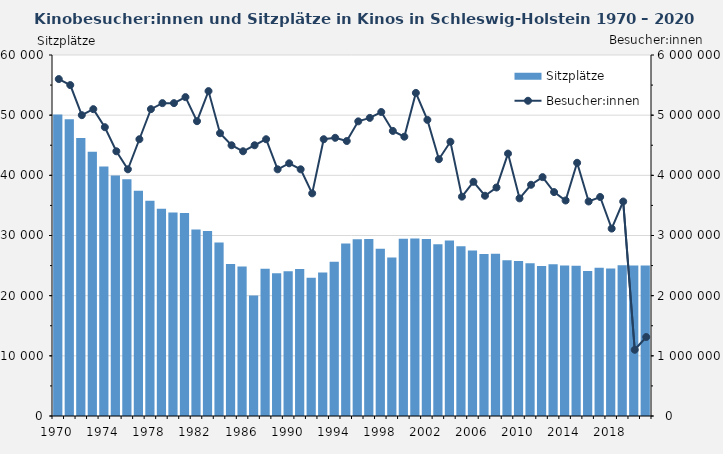
| Category | Sitzplätze |
|---|---|
| 1970.0 | 50131 |
| 1971.0 | 49340 |
| 1972.0 | 46218 |
| 1973.0 | 43920 |
| 1974.0 | 41476 |
| 1975.0 | 39984 |
| 1976.0 | 39356 |
| 1977.0 | 37439 |
| 1978.0 | 35790 |
| 1979.0 | 34452 |
| 1980.0 | 33811 |
| 1981.0 | 33753 |
| 1982.0 | 31007 |
| 1983.0 | 30746 |
| 1984.0 | 28841 |
| 1985.0 | 25277 |
| 1986.0 | 24832 |
| 1987.0 | 20012 |
| 1988.0 | 24488 |
| 1989.0 | 23738 |
| 1990.0 | 24053 |
| 1991.0 | 24435 |
| 1992.0 | 22976 |
| 1993.0 | 23830 |
| 1994.0 | 25626 |
| 1995.0 | 28679 |
| 1996.0 | 29392 |
| 1997.0 | 29428 |
| 1998.0 | 27782 |
| 1999.0 | 26345 |
| 2000.0 | 29453 |
| 2001.0 | 29522 |
| 2002.0 | 29407 |
| 2003.0 | 28564 |
| 2004.0 | 29184 |
| 2005.0 | 28231 |
| 2006.0 | 27493 |
| 2007.0 | 26941 |
| 2008.0 | 26959 |
| 2009.0 | 25887 |
| 2010.0 | 25769 |
| 2011.0 | 25402 |
| 2012.0 | 24920 |
| 2013.0 | 25234 |
| 2014.0 | 25012 |
| 2015.0 | 24979 |
| 2016.0 | 24110 |
| 2017.0 | 24656 |
| 2018.0 | 24507 |
| 2019.0 | 25048 |
| 2020.0 | 25018 |
| 2021.0 | 25018 |